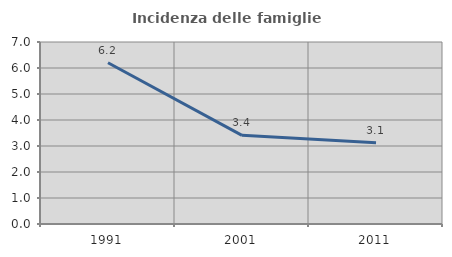
| Category | Incidenza delle famiglie numerose |
|---|---|
| 1991.0 | 6.2 |
| 2001.0 | 3.409 |
| 2011.0 | 3.125 |